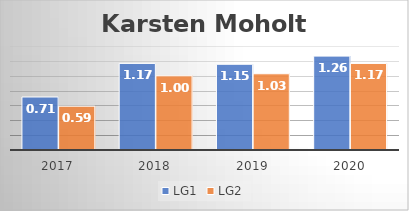
| Category | LG1 | LG2 |
|---|---|---|
| 2017.0 | 0.714 | 0.59 |
| 2018.0 | 1.166 | 0.999 |
| 2019.0 | 1.154 | 1.026 |
| 2020.0 | 1.264 | 1.165 |